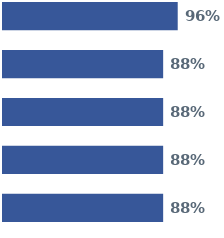
| Category | Series 0 | Series 1 | Series 2 | Series 3 | Series 4 |
|---|---|---|---|---|---|
| 0 | 0.96 | 0.88 | 0.88 | 0.88 | 0.88 |